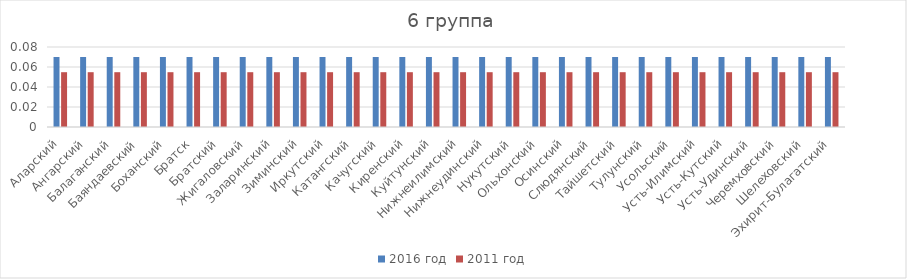
| Category | 2016 год | 2011 год |
|---|---|---|
| Аларский | 0.07 | 0.055 |
| Ангарский | 0.07 | 0.055 |
| Балаганский | 0.07 | 0.055 |
| Баяндаевский | 0.07 | 0.055 |
| Боханский | 0.07 | 0.055 |
| Братск | 0.07 | 0.055 |
| Братский | 0.07 | 0.055 |
| Жигаловский | 0.07 | 0.055 |
| Заларинский | 0.07 | 0.055 |
| Зиминский | 0.07 | 0.055 |
| Иркутский | 0.07 | 0.055 |
| Катангский | 0.07 | 0.055 |
| Качугский | 0.07 | 0.055 |
| Киренский | 0.07 | 0.055 |
| Куйтунский | 0.07 | 0.055 |
| Нижнеилимский | 0.07 | 0.055 |
| Нижнеудинский | 0.07 | 0.055 |
| Нукутский | 0.07 | 0.055 |
| Ольхонский | 0.07 | 0.055 |
| Осинский | 0.07 | 0.055 |
| Слюдянский | 0.07 | 0.055 |
| Тайшетский | 0.07 | 0.055 |
| Тулунский | 0.07 | 0.055 |
| Усольский | 0.07 | 0.055 |
| Усть-Илимский | 0.07 | 0.055 |
| Усть-Кутский | 0.07 | 0.055 |
| Усть-Удинский | 0.07 | 0.055 |
| Черемховский | 0.07 | 0.055 |
| Шелеховский | 0.07 | 0.055 |
| Эхирит-Булагатский | 0.07 | 0.055 |